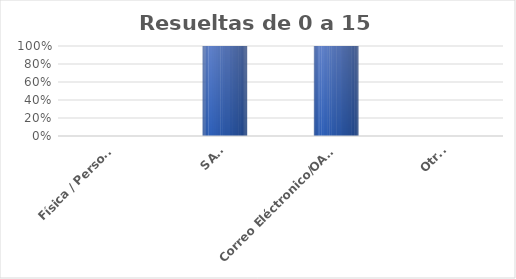
| Category | Series 0 |
|---|---|
| Física / Personal | 0 |
| SAIP | 3 |
| Correo Eléctronico/OAI/Info/Contacto | 8 |
| Otras | 0 |